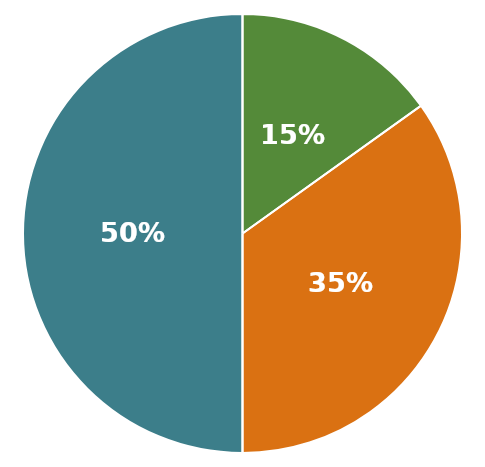
| Category | Celkem Aktiva |
|---|---|
| 0 | 1902500 |
| 1 | 575000 |
| 2 | 1327500 |